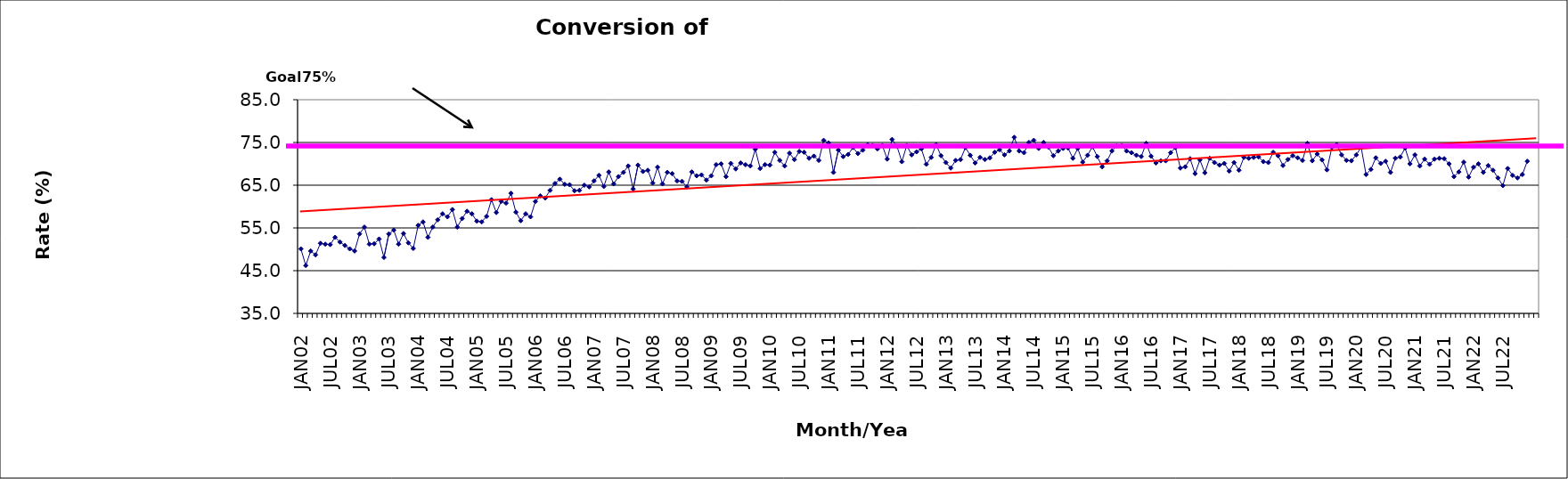
| Category | Series 0 |
|---|---|
| JAN02 | 50.1 |
| FEB02 | 46.2 |
| MAR02 | 49.6 |
| APR02 | 48.7 |
| MAY02 | 51.4 |
| JUN02 | 51.2 |
| JUL02 | 51.1 |
| AUG02 | 52.8 |
| SEP02 | 51.7 |
| OCT02 | 50.9 |
| NOV02 | 50.1 |
| DEC02 | 49.6 |
| JAN03 | 53.6 |
| FEB03 | 55.2 |
| MAR03 | 51.2 |
| APR03 | 51.3 |
| MAY03 | 52.4 |
| JUN03 | 48.1 |
| JUL03 | 53.6 |
| AUG03 | 54.5 |
| SEP03 | 51.2 |
| OCT03 | 53.7 |
| NOV03 | 51.5 |
| DEC03 | 50.2 |
| JAN04 | 55.6 |
| FEB04 | 56.4 |
| MAR04 | 52.8 |
| APR04 | 55.2 |
| MAY04 | 56.9 |
| JUN04 | 58.3 |
| JUL04 | 57.6 |
| AUG04 | 59.3 |
| SEP04 | 55.2 |
| OCT04 | 57.2 |
| NOV04 | 58.9 |
| DEC04 | 58.3 |
| JAN05 | 56.6 |
| FEB05 | 56.4 |
| MAR05 | 57.7 |
| APR05 | 61.6 |
| MAY05 | 58.6 |
| JUN05 | 61.2 |
| JUL05 | 60.8 |
| AUG05 | 63.1 |
| SEP05 | 58.7 |
| OCT05 | 56.7 |
| NOV05 | 58.3 |
| DEC05 | 57.6 |
| JAN06 | 61.2 |
| FEB06 | 62.5 |
| MAR06 | 62 |
| APR06 | 63.8 |
| MAY06 | 65.4 |
| JUN06 | 66.4 |
| JUL06 | 65.2 |
| AUG06 | 65.1 |
| SEP06 | 63.7 |
| OCT06 | 63.8 |
| NOV06 | 65 |
| DEC06 | 64.6 |
| JAN07 | 66 |
| FEB07 | 67.3 |
| MAR07 | 64.7 |
| APR07 | 68.1 |
| MAY07 | 65.3 |
| JUN07 | 67 |
| JUL07 | 68 |
| AUG07 | 69.5 |
| SEP07 | 64.1 |
| OCT07 | 69.7 |
| NOV07 | 68.2 |
| DEC07 | 68.5 |
| JAN08 | 65.5 |
| FEB08 | 69.2 |
| MAR08 | 65.3 |
| APR08 | 68 |
| MAY08 | 67.7 |
| JUN08 | 66 |
| JUL08 | 65.9 |
| AUG08 | 64.6 |
| SEP08 | 68.1 |
| OCT08 | 67.2 |
| NOV08 | 67.4 |
| DEC08 | 66.2 |
| JAN09 | 67.2 |
| FEB09 | 69.8 |
| MAR09 | 70 |
| APR09 | 67 |
| MAY09 | 70.1 |
| JUN09 | 68.8 |
| JUL09 | 70.2 |
| AUG09 | 69.8 |
| SEP09 | 69.5 |
| OCT09 | 73.4 |
| NOV09 | 68.9 |
| DEC09 | 69.8 |
| JAN10 | 69.7 |
| FEB10 | 72.7 |
| MAR10 | 70.8 |
| APR10 | 69.5 |
| MAY10 | 72.5 |
| JUN10 | 71 |
| JUL10 | 72.9 |
| AUG10 | 72.7 |
| SEP10 | 71.3 |
| OCT10 | 71.8 |
| NOV10 | 70.8 |
| DEC10 | 75.5 |
| JAN11 | 74.9 |
| FEB11 | 68 |
| MAR11 | 73.2 |
| APR11 | 71.7 |
| MAY11 | 72.2 |
| JUN11 | 73.8 |
| JUL11 | 72.4 |
| AUG11 | 73.2 |
| SEP11 | 74.5 |
| OCT11 | 74.3 |
| NOV11 | 73.5 |
| DEC11 | 74.3 |
| JAN12 | 71.1 |
| FEB12 | 75.7 |
| MAR12 | 74.1 |
| APR12 | 70.5 |
| MAY12 | 74.3 |
| JUN12 | 72.1 |
| JUL12 | 72.8 |
| AUG12 | 73.5 |
| SEP12 | 69.9 |
| OCT12 | 71.5 |
| NOV12 | 74.5 |
| DEC12 | 71.9 |
| JAN13 | 70.3 |
| FEB13 | 69 |
| MAR13 | 70.8 |
| APR13 | 71 |
| MAY13 | 73.8 |
| JUN13 | 72 |
| JUL13 | 70.2 |
| AUG13 | 71.5 |
| SEP13 | 71 |
| OCT13 | 71.4 |
| NOV13 | 72.7 |
| DEC13 | 73.3 |
| JAN14 | 72.1 |
| FEB14 | 73 |
| MAR14 | 76.2 |
| APR14 | 73 |
| MAY14 | 72.6 |
| JUN14 | 75 |
| JUL14 | 75.5 |
| AUG14 | 73.6 |
| SEP14 | 75 |
| OCT14 | 73.9 |
| NOV14 | 71.9 |
| DEC14 | 73 |
| JAN15 | 73.6 |
| FEB15 | 73.7 |
| MAR15 | 71.3 |
| APR15 | 73.6 |
| MAY15 | 70.4 |
| JUN15 | 72 |
| JUL15 | 74 |
| AUG15 | 71.7 |
| SEP15 | 69.3 |
| OCT15 | 70.7 |
| NOV15 | 73 |
| DEC15 | 74.2 |
| JAN16 | 74.3 |
| FEB16 | 73 |
| MAR16 | 72.6 |
| APR16 | 72 |
| MAY16 | 71.7 |
| JUN16 | 74.8 |
| JUL16 | 71.8 |
| AUG16 | 70.2 |
| SEP16 | 70.7 |
| OCT16 | 70.7 |
| NOV16 | 72.6 |
| DEC16 | 73.8 |
| JAN17 | 69 |
| FEB17 | 69.3 |
| MAR17 | 71.2 |
| APR17 | 67.7 |
| MAY17 | 70.9 |
| JUN17 | 67.9 |
| JUL17 | 71.3 |
| AUG17 | 70.3 |
| SEP17 | 69.7 |
| OCT17 | 70.1 |
| NOV17 | 68.3 |
| DEC17 | 70.3 |
| JAN18 | 68.5 |
| FEB18 | 71.5 |
| MAR18 | 71.3 |
| APR18 | 71.5 |
| MAY18 | 71.6 |
| JUN18 | 70.5 |
| JUL18 | 70.3 |
| AUG18 | 72.7 |
| SEP18 | 71.9 |
| OCT18 | 69.6 |
| NOV18 | 71 |
| DEC18 | 71.9 |
| JAN19 | 71.4 |
| FEB19 | 70.8 |
| MAR19 | 74.8 |
| APR19 | 70.7 |
| MAY19 | 72.3 |
| JUN19 | 70.9 |
| JUL19 | 68.6 |
| AUG19 | 73.8 |
| SEP19 | 74.5 |
| OCT19 | 72.1 |
| NOV19 | 70.8 |
| DEC19 | 70.7 |
| JAN20 | 72.1 |
| FEB20 | 73.9 |
| MAR20 | 67.5 |
| APR20 | 68.7 |
| MAY20 | 71.4 |
| JUN20 | 70.1 |
| JUL20 | 70.6 |
| AUG20 | 68 |
| SEP20 | 71.3 |
| OCT20 | 71.6 |
| NOV20 | 73.7 |
| DEC20 | 70 |
| JAN21 | 72.1 |
| FEB21 | 69.5 |
| MAR21 | 71.1 |
| APR21 | 69.9 |
| MAY21 | 71.1 |
| JUN21 | 71.3 |
| JUL21 | 71.2 |
| AUG21 | 70 |
| SEP21 | 67 |
| OCT21 | 68.1 |
| NOV21 | 70.4 |
| DEC21 | 66.9 |
| JAN22 | 69.2 |
| FEB22 | 70 |
| MAR22 | 68 |
| APR22 | 69.6 |
| MAY22 | 68.5 |
| JUN22 | 66.7 |
| JUL22 | 64.9 |
| AUG22 | 68.9 |
| SEP22 | 67.3 |
| OCT22 | 66.7 |
| NOV22 | 67.5 |
| DEC22 | 70.6 |